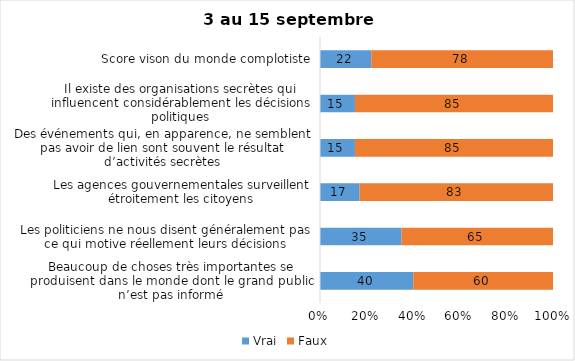
| Category | Vrai | Faux |
|---|---|---|
| Beaucoup de choses très importantes se produisent dans le monde dont le grand public n’est pas informé | 40 | 60 |
| Les politiciens ne nous disent généralement pas ce qui motive réellement leurs décisions | 35 | 65 |
| Les agences gouvernementales surveillent étroitement les citoyens | 17 | 83 |
| Des événements qui, en apparence, ne semblent pas avoir de lien sont souvent le résultat d’activités secrètes | 15 | 85 |
| Il existe des organisations secrètes qui influencent considérablement les décisions politiques | 15 | 85 |
| Score vison du monde complotiste | 22 | 78 |